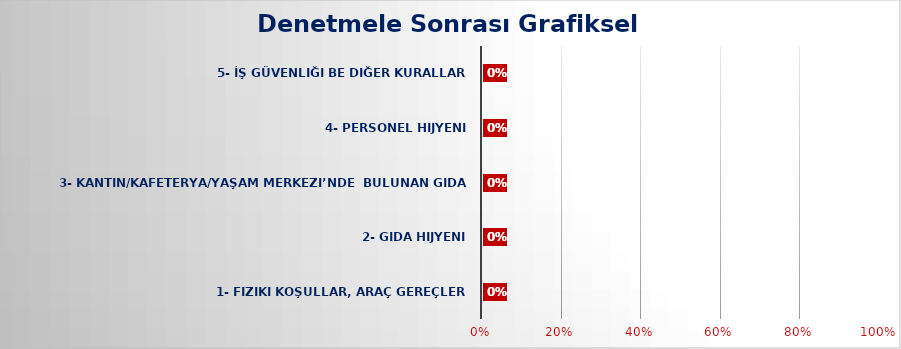
| Category | Series 11 |
|---|---|
| 1- Fiziki Koşullar, Araç Gereçler | 0 |
| 2- Gıda Hijyeni | 0 |
| 3- Kantin/Kafeterya/Yaşam Merkezi’nde  bulunan gıda ürünlerinin; | 0 |
| 4- Personel Hijyeni | 0 |
| 5- İş Güvenliği be Diğer Kurallar | 0 |